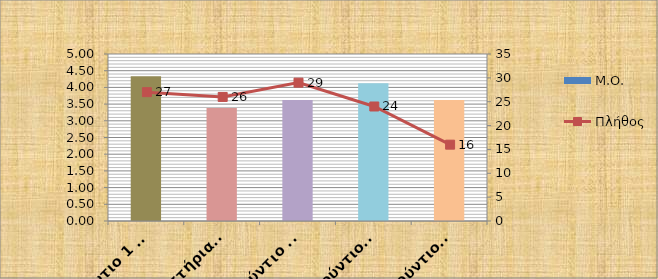
| Category | Μ.Ο. |
|---|---|
| Στούντιο 1 (Σχέδιο Χρώμα) | 4.333 |
| Εργαστήρια Ελεύθερου Σχεδίου 1 | 3.385 |
| Στούντιο 3  | 3.621 |
| Στούντιο 5 | 4.125 |
| Στούντιο 7 | 3.625 |